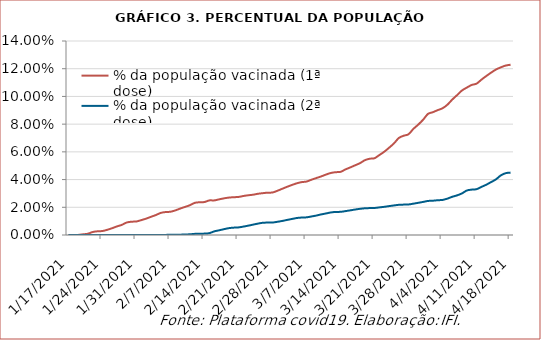
| Category | % da população vacinada (1ª dose) | % da população vacinada (2ª dose) |
|---|---|---|
| 1/17/21 | 0 | 0 |
| 1/18/21 | 0 | 0 |
| 1/19/21 | 0 | 0 |
| 1/20/21 | 0 | 0 |
| 1/21/21 | 0.001 | 0 |
| 1/22/21 | 0.002 | 0 |
| 1/23/21 | 0.003 | 0 |
| 1/24/21 | 0.003 | 0 |
| 1/25/21 | 0.004 | 0 |
| 1/26/21 | 0.005 | 0 |
| 1/27/21 | 0.006 | 0 |
| 1/28/21 | 0.007 | 0 |
| 1/29/21 | 0.009 | 0 |
| 1/30/21 | 0.01 | 0 |
| 1/31/21 | 0.01 | 0 |
| 2/1/21 | 0.011 | 0 |
| 2/2/21 | 0.012 | 0 |
| 2/3/21 | 0.013 | 0 |
| 2/4/21 | 0.014 | 0 |
| 2/5/21 | 0.016 | 0 |
| 2/6/21 | 0.017 | 0 |
| 2/7/21 | 0.017 | 0 |
| 2/8/21 | 0.018 | 0 |
| 2/9/21 | 0.019 | 0 |
| 2/10/21 | 0.02 | 0 |
| 2/11/21 | 0.021 | 0.001 |
| 2/12/21 | 0.023 | 0.001 |
| 2/13/21 | 0.024 | 0.001 |
| 2/14/21 | 0.024 | 0.001 |
| 2/15/21 | 0.025 | 0.001 |
| 2/16/21 | 0.025 | 0.003 |
| 2/17/21 | 0.026 | 0.003 |
| 2/18/21 | 0.026 | 0.004 |
| 2/19/21 | 0.027 | 0.005 |
| 2/20/21 | 0.027 | 0.005 |
| 2/21/21 | 0.027 | 0.005 |
| 2/22/21 | 0.028 | 0.006 |
| 2/23/21 | 0.029 | 0.007 |
| 2/24/21 | 0.029 | 0.007 |
| 2/25/21 | 0.03 | 0.008 |
| 2/26/21 | 0.03 | 0.009 |
| 2/27/21 | 0.031 | 0.009 |
| 2/28/21 | 0.031 | 0.009 |
| 3/1/21 | 0.032 | 0.01 |
| 3/2/21 | 0.033 | 0.01 |
| 3/3/21 | 0.035 | 0.011 |
| 3/4/21 | 0.036 | 0.012 |
| 3/5/21 | 0.037 | 0.012 |
| 3/6/21 | 0.038 | 0.013 |
| 3/7/21 | 0.039 | 0.013 |
| 3/8/21 | 0.04 | 0.013 |
| 3/9/21 | 0.041 | 0.014 |
| 3/10/21 | 0.042 | 0.015 |
| 3/11/21 | 0.044 | 0.016 |
| 3/12/21 | 0.045 | 0.016 |
| 3/13/21 | 0.045 | 0.017 |
| 3/14/21 | 0.046 | 0.017 |
| 3/15/21 | 0.047 | 0.017 |
| 3/16/21 | 0.049 | 0.018 |
| 3/17/21 | 0.05 | 0.018 |
| 3/18/21 | 0.052 | 0.019 |
| 3/19/21 | 0.054 | 0.019 |
| 3/20/21 | 0.055 | 0.019 |
| 3/21/21 | 0.055 | 0.02 |
| 3/22/21 | 0.058 | 0.02 |
| 3/23/21 | 0.06 | 0.02 |
| 3/24/21 | 0.063 | 0.021 |
| 3/25/21 | 0.066 | 0.021 |
| 3/26/21 | 0.07 | 0.022 |
| 3/27/21 | 0.072 | 0.022 |
| 3/28/21 | 0.073 | 0.022 |
| 3/29/21 | 0.077 | 0.023 |
| 3/30/21 | 0.08 | 0.023 |
| 3/31/21 | 0.083 | 0.024 |
| 4/1/21 | 0.087 | 0.025 |
| 4/2/21 | 0.089 | 0.025 |
| 4/3/21 | 0.09 | 0.025 |
| 4/4/21 | 0.091 | 0.025 |
| 4/5/21 | 0.094 | 0.026 |
| 4/6/21 | 0.098 | 0.028 |
| 4/7/21 | 0.101 | 0.029 |
| 4/8/21 | 0.104 | 0.03 |
| 4/9/21 | 0.106 | 0.032 |
| 4/10/21 | 0.108 | 0.033 |
| 4/11/21 | 0.109 | 0.033 |
| 4/12/21 | 0.112 | 0.035 |
| 4/13/21 | 0.115 | 0.036 |
| 4/14/21 | 0.117 | 0.038 |
| 4/15/21 | 0.119 | 0.04 |
| 4/16/21 | 0.121 | 0.043 |
| 4/17/21 | 0.122 | 0.045 |
| 4/18/21 | 0.123 | 0.045 |